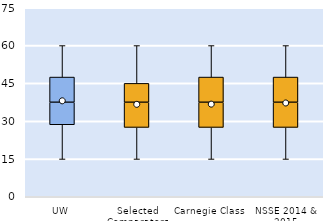
| Category | 25th | 50th | 75th |
|---|---|---|---|
| UW | 28.571 | 8.929 | 10 |
| Selected Comparators | 27.5 | 10 | 7.5 |
| Carnegie Class | 27.5 | 10 | 10 |
| NSSE 2014 & 2015 | 27.5 | 10 | 10 |